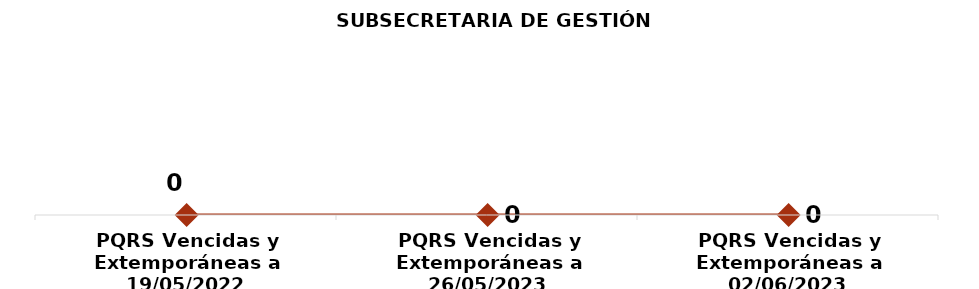
| Category | SUBSECRETARIA DE GESTIÓN INSTITUCIONAL |
|---|---|
| PQRS Vencidas y Extemporáneas a 19/05/2022 | 0 |
| PQRS Vencidas y Extemporáneas a 26/05/2023 | 0 |
| PQRS Vencidas y Extemporáneas a 02/06/2023 | 0 |